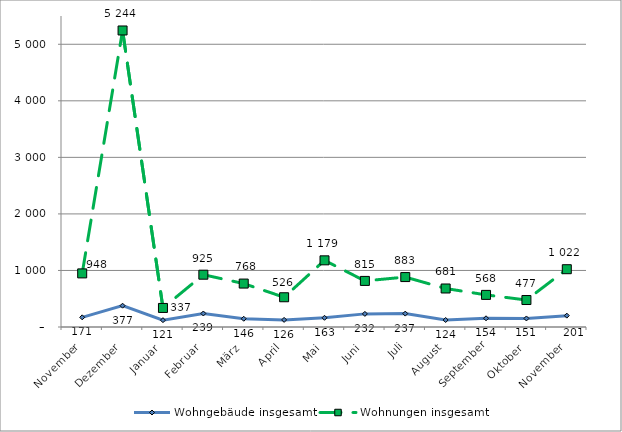
| Category | Wohngebäude insgesamt | Wohnungen insgesamt |
|---|---|---|
| November | 171 | 948 |
| Dezember | 377 | 5244 |
| Januar | 121 | 337 |
| Februar | 239 | 925 |
| März | 146 | 768 |
| April | 126 | 526 |
| Mai | 163 | 1179 |
| Juni | 232 | 815 |
| Juli | 237 | 883 |
| August | 124 | 681 |
| September | 154 | 568 |
| Oktober | 151 | 477 |
| November | 201 | 1022 |